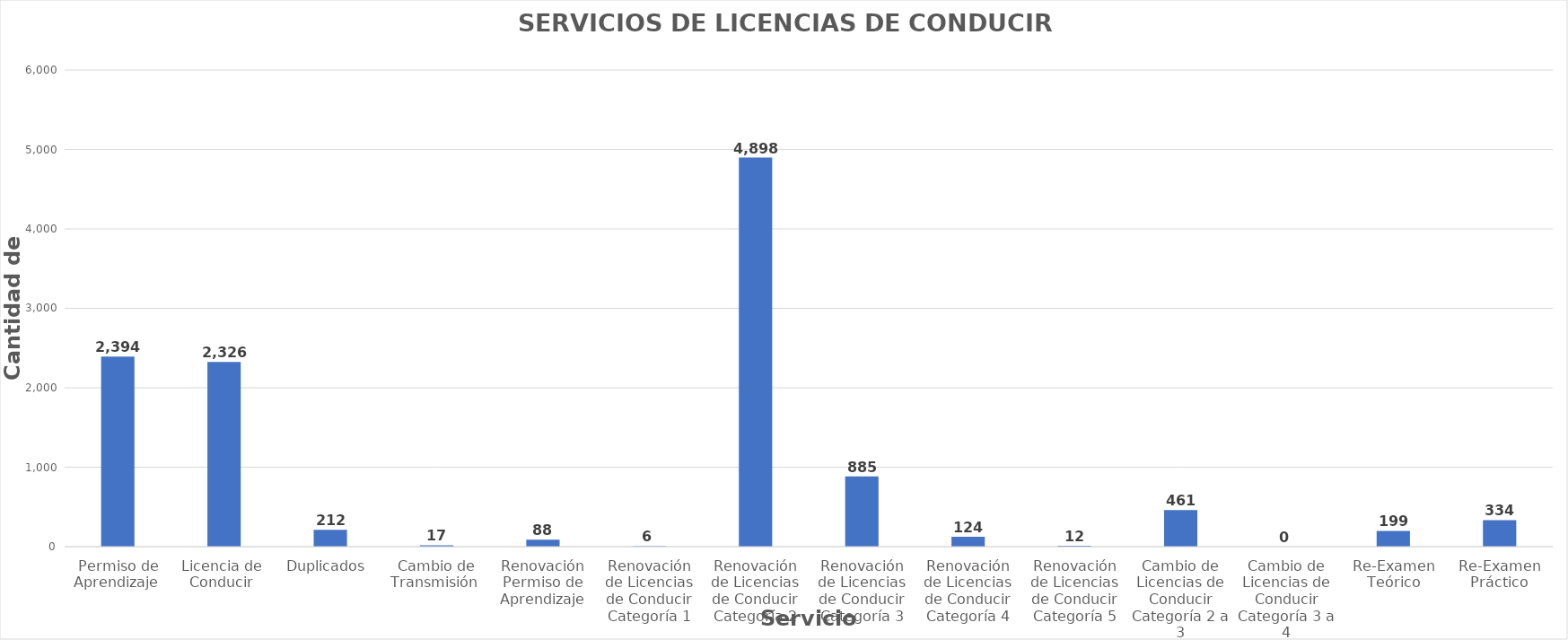
| Category | Series 0 |
|---|---|
| Permiso de Aprendizaje  | 2394 |
| Licencia de  Conducir  | 2326 |
| Duplicados  | 212 |
| Cambio de Transmisión  | 17 |
| Renovación Permiso de Aprendizaje | 88 |
| Renovación de Licencias de Conducir Categoría 1 | 6 |
| Renovación de Licencias de Conducir Categoría 2 | 4898 |
| Renovación de Licencias de Conducir Categoría 3 | 885 |
| Renovación de Licencias de Conducir Categoría 4 | 124 |
| Renovación de Licencias de Conducir Categoría 5 | 12 |
| Cambio de Licencias de Conducir Categoría 2 a 3 | 461 |
| Cambio de Licencias de Conducir Categoría 3 a 4 | 0 |
| Re-Examen Teórico | 199 |
| Re-Examen Práctico | 334 |